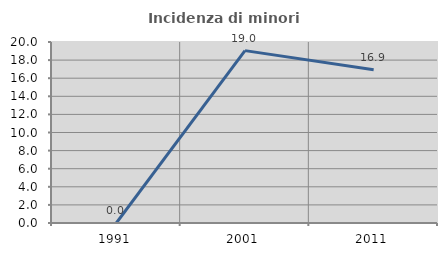
| Category | Incidenza di minori stranieri |
|---|---|
| 1991.0 | 0 |
| 2001.0 | 19.048 |
| 2011.0 | 16.931 |